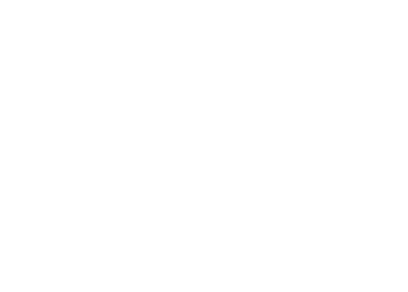
| Category | Total |
|---|---|
| A iniciar | 173 |
| Atrasado | 19 |
| Cancelado | 2 |
| Concluído | 10 |
| Em dia | 146 |
| Suspenso | 3 |